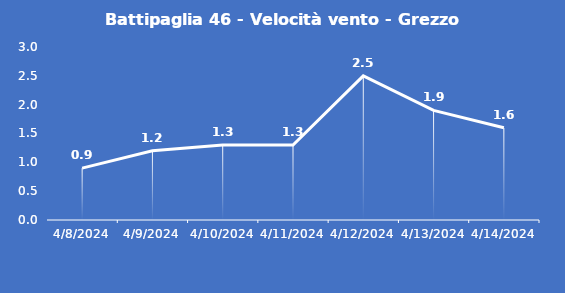
| Category | Battipaglia 46 - Velocità vento - Grezzo (m/s) |
|---|---|
| 4/8/24 | 0.9 |
| 4/9/24 | 1.2 |
| 4/10/24 | 1.3 |
| 4/11/24 | 1.3 |
| 4/12/24 | 2.5 |
| 4/13/24 | 1.9 |
| 4/14/24 | 1.6 |